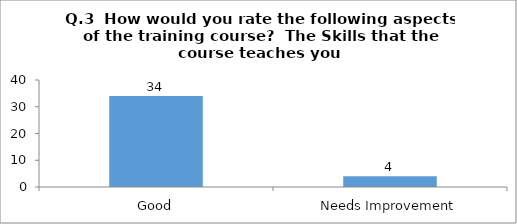
| Category | Q.3  How would you rate the following aspects of the training course?  |
|---|---|
| Good | 34 |
| Needs Improvement | 4 |